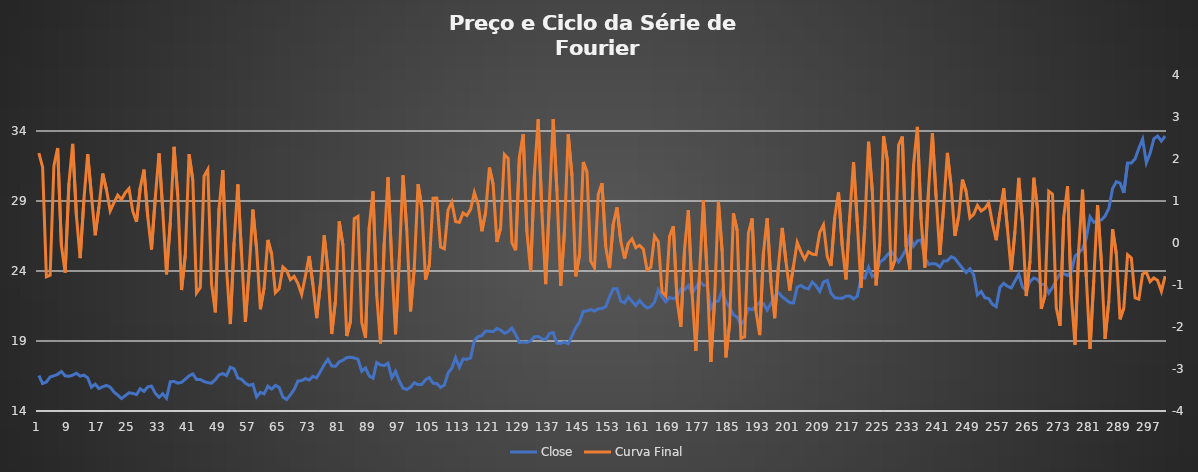
| Category | Close |
|---|---|
| 0 | 16.53 |
| 1 | 15.96 |
| 2 | 16.07 |
| 3 | 16.43 |
| 4 | 16.51 |
| 5 | 16.62 |
| 6 | 16.82 |
| 7 | 16.51 |
| 8 | 16.48 |
| 9 | 16.56 |
| 10 | 16.7 |
| 11 | 16.49 |
| 12 | 16.56 |
| 13 | 16.37 |
| 14 | 15.7 |
| 15 | 15.92 |
| 16 | 15.6 |
| 17 | 15.73 |
| 18 | 15.83 |
| 19 | 15.7 |
| 20 | 15.36 |
| 21 | 15.14 |
| 22 | 14.89 |
| 23 | 15.09 |
| 24 | 15.3 |
| 25 | 15.26 |
| 26 | 15.17 |
| 27 | 15.59 |
| 28 | 15.4 |
| 29 | 15.72 |
| 30 | 15.78 |
| 31 | 15.27 |
| 32 | 14.98 |
| 33 | 15.23 |
| 34 | 14.91 |
| 35 | 16.09 |
| 36 | 16.11 |
| 37 | 15.99 |
| 38 | 16.05 |
| 39 | 16.27 |
| 40 | 16.51 |
| 41 | 16.65 |
| 42 | 16.25 |
| 43 | 16.25 |
| 44 | 16.11 |
| 45 | 16.02 |
| 46 | 15.99 |
| 47 | 16.24 |
| 48 | 16.58 |
| 49 | 16.67 |
| 50 | 16.53 |
| 51 | 17.13 |
| 52 | 17.01 |
| 53 | 16.35 |
| 54 | 16.26 |
| 55 | 15.99 |
| 56 | 15.83 |
| 57 | 15.91 |
| 58 | 15.01 |
| 59 | 15.33 |
| 60 | 15.23 |
| 61 | 15.77 |
| 62 | 15.56 |
| 63 | 15.83 |
| 64 | 15.69 |
| 65 | 14.99 |
| 66 | 14.82 |
| 67 | 15.16 |
| 68 | 15.54 |
| 69 | 16.14 |
| 70 | 16.17 |
| 71 | 16.32 |
| 72 | 16.21 |
| 73 | 16.47 |
| 74 | 16.37 |
| 75 | 16.83 |
| 76 | 17.31 |
| 77 | 17.69 |
| 78 | 17.22 |
| 79 | 17.19 |
| 80 | 17.51 |
| 81 | 17.63 |
| 82 | 17.81 |
| 83 | 17.84 |
| 84 | 17.79 |
| 85 | 17.7 |
| 86 | 16.84 |
| 87 | 17.08 |
| 88 | 16.5 |
| 89 | 16.34 |
| 90 | 17.46 |
| 91 | 17.29 |
| 92 | 17.25 |
| 93 | 17.41 |
| 94 | 16.38 |
| 95 | 16.83 |
| 96 | 16.14 |
| 97 | 15.63 |
| 98 | 15.54 |
| 99 | 15.7 |
| 100 | 16.02 |
| 101 | 15.89 |
| 102 | 15.9 |
| 103 | 16.23 |
| 104 | 16.39 |
| 105 | 15.98 |
| 106 | 15.96 |
| 107 | 15.69 |
| 108 | 15.85 |
| 109 | 16.71 |
| 110 | 17.06 |
| 111 | 17.81 |
| 112 | 17.12 |
| 113 | 17.72 |
| 114 | 17.69 |
| 115 | 17.79 |
| 116 | 19.04 |
| 117 | 19.31 |
| 118 | 19.39 |
| 119 | 19.71 |
| 120 | 19.7 |
| 121 | 19.66 |
| 122 | 19.9 |
| 123 | 19.78 |
| 124 | 19.55 |
| 125 | 19.67 |
| 126 | 19.93 |
| 127 | 19.46 |
| 128 | 18.9 |
| 129 | 18.93 |
| 130 | 18.9 |
| 131 | 19.02 |
| 132 | 19.3 |
| 133 | 19.32 |
| 134 | 19.16 |
| 135 | 19.1 |
| 136 | 19.53 |
| 137 | 19.6 |
| 138 | 18.84 |
| 139 | 18.83 |
| 140 | 18.92 |
| 141 | 18.8 |
| 142 | 19.36 |
| 143 | 19.95 |
| 144 | 20.35 |
| 145 | 21.11 |
| 146 | 21.15 |
| 147 | 21.24 |
| 148 | 21.14 |
| 149 | 21.29 |
| 150 | 21.33 |
| 151 | 21.45 |
| 152 | 22.15 |
| 153 | 22.74 |
| 154 | 22.74 |
| 155 | 21.84 |
| 156 | 21.72 |
| 157 | 22.15 |
| 158 | 21.83 |
| 159 | 21.53 |
| 160 | 21.9 |
| 161 | 21.58 |
| 162 | 21.37 |
| 163 | 21.45 |
| 164 | 21.78 |
| 165 | 22.66 |
| 166 | 22.15 |
| 167 | 21.8 |
| 168 | 22.11 |
| 169 | 22.02 |
| 170 | 22.15 |
| 171 | 22.72 |
| 172 | 22.65 |
| 173 | 22.97 |
| 174 | 22.41 |
| 175 | 22.82 |
| 176 | 23.27 |
| 177 | 22.99 |
| 178 | 22.98 |
| 179 | 21.35 |
| 180 | 21.79 |
| 181 | 21.86 |
| 182 | 22.62 |
| 183 | 21.81 |
| 184 | 21.39 |
| 185 | 20.88 |
| 186 | 20.7 |
| 187 | 20.15 |
| 188 | 20.55 |
| 189 | 21.32 |
| 190 | 21.23 |
| 191 | 21.52 |
| 192 | 21.76 |
| 193 | 21.68 |
| 194 | 21.21 |
| 195 | 21.68 |
| 196 | 22.15 |
| 197 | 22.46 |
| 198 | 22.16 |
| 199 | 21.95 |
| 200 | 21.74 |
| 201 | 21.72 |
| 202 | 22.85 |
| 203 | 22.97 |
| 204 | 22.79 |
| 205 | 22.72 |
| 206 | 23.21 |
| 207 | 22.94 |
| 208 | 22.54 |
| 209 | 23.22 |
| 210 | 23.33 |
| 211 | 22.42 |
| 212 | 22.09 |
| 213 | 22.06 |
| 214 | 22.06 |
| 215 | 22.2 |
| 216 | 22.22 |
| 217 | 22 |
| 218 | 22.2 |
| 219 | 23.53 |
| 220 | 23.49 |
| 221 | 24.26 |
| 222 | 23.6 |
| 223 | 23.8 |
| 224 | 24.63 |
| 225 | 24.82 |
| 226 | 25.15 |
| 227 | 25.4 |
| 228 | 25.07 |
| 229 | 24.65 |
| 230 | 25.07 |
| 231 | 25.56 |
| 232 | 26.56 |
| 233 | 25.79 |
| 234 | 26.15 |
| 235 | 26.22 |
| 236 | 24.97 |
| 237 | 24.47 |
| 238 | 24.53 |
| 239 | 24.5 |
| 240 | 24.29 |
| 241 | 24.71 |
| 242 | 24.73 |
| 243 | 25.02 |
| 244 | 24.9 |
| 245 | 24.54 |
| 246 | 24.2 |
| 247 | 23.89 |
| 248 | 24.16 |
| 249 | 23.73 |
| 250 | 22.29 |
| 251 | 22.54 |
| 252 | 22.09 |
| 253 | 22.03 |
| 254 | 21.62 |
| 255 | 21.45 |
| 256 | 22.83 |
| 257 | 23.12 |
| 258 | 22.91 |
| 259 | 22.79 |
| 260 | 23.28 |
| 261 | 23.78 |
| 262 | 22.87 |
| 263 | 22.58 |
| 264 | 23.24 |
| 265 | 23.5 |
| 266 | 23.39 |
| 267 | 23.04 |
| 268 | 23.05 |
| 269 | 22.43 |
| 270 | 22.82 |
| 271 | 23.34 |
| 272 | 23.81 |
| 273 | 23.8 |
| 274 | 23.68 |
| 275 | 23.93 |
| 276 | 25.05 |
| 277 | 25.31 |
| 278 | 25.58 |
| 279 | 26.35 |
| 280 | 27.87 |
| 281 | 27.48 |
| 282 | 27.61 |
| 283 | 27.65 |
| 284 | 27.92 |
| 285 | 28.46 |
| 286 | 29.89 |
| 287 | 30.38 |
| 288 | 30.28 |
| 289 | 29.58 |
| 290 | 31.71 |
| 291 | 31.72 |
| 292 | 32.01 |
| 293 | 32.76 |
| 294 | 33.42 |
| 295 | 31.73 |
| 296 | 32.41 |
| 297 | 33.44 |
| 298 | 33.64 |
| 299 | 33.28 |
| 300 | 33.64 |